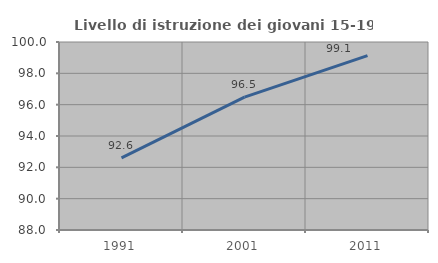
| Category | Livello di istruzione dei giovani 15-19 anni |
|---|---|
| 1991.0 | 92.606 |
| 2001.0 | 96.48 |
| 2011.0 | 99.129 |